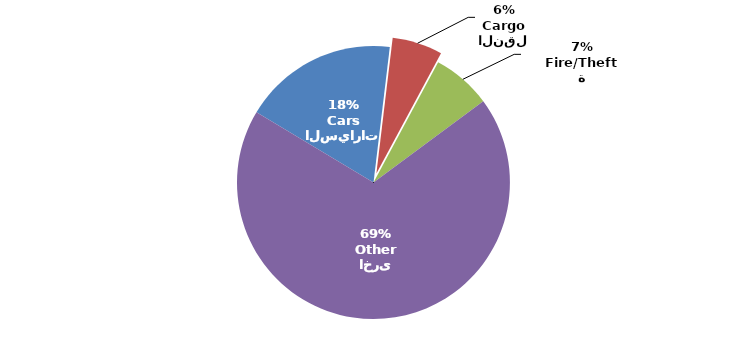
| Category | Series 0 |
|---|---|
| السيارات
Cars | 551758 |
| النقل
Cargo | 179239 |
| الحريق/السرقة
Fire/Theft | 211512 |
| اخرى
Other | 2073240 |